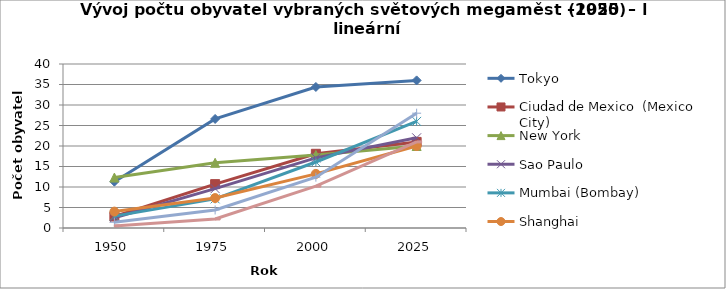
| Category | Tokyo | Ciudad de Mexico  (Mexico City) | New York | Sao Paulo | Mumbai (Bombay) | Shanghai | Delhi | Dhaka |
|---|---|---|---|---|---|---|---|---|
| 1950.0 | 11.3 | 2.8 | 12.3 | 2.5 | 2.9 | 4 | 1.4 | 0.5 |
| 1975.0 | 26.6 | 10.7 | 15.9 | 9.6 | 7.1 | 7.3 | 4.4 | 2.2 |
| 2000.0 | 34.4 | 18.1 | 17.8 | 17.1 | 16.1 | 13.2 | 12.4 | 10.2 |
| 2025.0 | 36 | 21 | 20 | 22 | 26 | 20 | 28 | 21 |